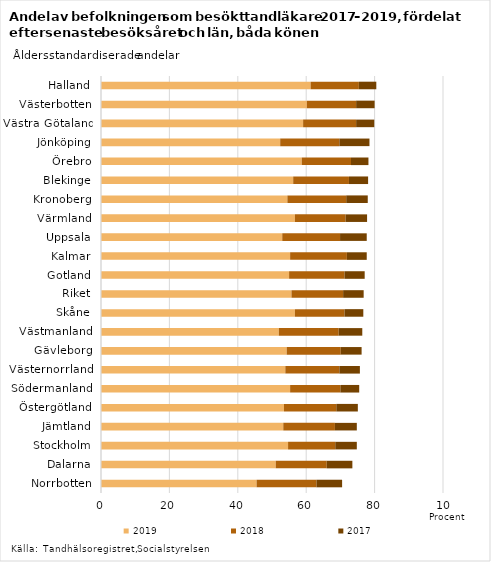
| Category | 2019 | 2018 | 2017 |
|---|---|---|---|
| Norrbotten | 45.5 | 17.5 | 7.5 |
| Dalarna | 51.1 | 14.9 | 7.5 |
| Stockholm | 54.7 | 13.8 | 6.3 |
| Jämtland | 53.3 | 15.1 | 6.4 |
| Östergötland | 53.5 | 15.3 | 6.3 |
| Södermanland | 55.3 | 14.7 | 5.5 |
| Västernorrland | 53.9 | 15.8 | 6 |
| Gävleborg | 54.3 | 15.8 | 6.1 |
| Västmanland | 52 | 17.5 | 6.9 |
| Skåne | 56.7 | 14.5 | 5.5 |
| Riket | 55.7 | 15.1 | 6 |
| Gotland | 55 | 16.2 | 5.9 |
| Kalmar | 55.3 | 16.6 | 5.8 |
| Uppsala | 53 | 16.9 | 7.8 |
| Värmland | 56.7 | 14.8 | 6.3 |
| Kronoberg | 54.5 | 17.2 | 6.3 |
| Blekinge | 56.2 | 16.3 | 5.6 |
| Örebro | 58.7 | 14.4 | 5.1 |
| Jönköping | 52.4 | 17.3 | 8.8 |
| Västra Götaland | 59.1 | 15.5 | 5.3 |
| Västerbotten | 60.2 | 14.4 | 5.4 |
| Halland | 61.3 | 14.1 | 5.1 |